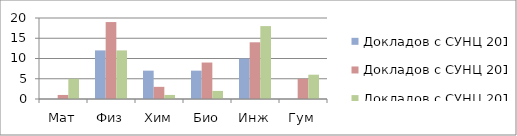
| Category | Докладов с СУНЦ 2016 | Докладов с СУНЦ 2017 | Докладов с СУНЦ 2018 |
|---|---|---|---|
| Мат | 0 | 1 | 5 |
| Физ | 12 | 19 | 12 |
| Хим | 7 | 3 | 1 |
| Био | 7 | 9 | 2 |
| Инж | 10 | 14 | 18 |
| Гум | 0 | 5 | 6 |